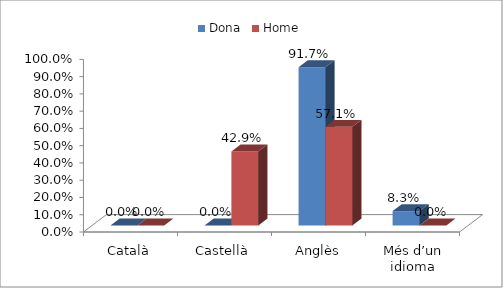
| Category | Dona | Home |
|---|---|---|
| Català | 0 | 0 |
| Castellà | 0 | 0.429 |
| Anglès | 0.917 | 0.571 |
| Més d’un idioma | 0.083 | 0 |